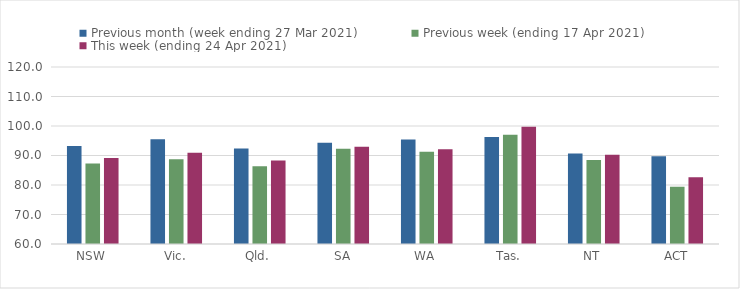
| Category | Previous month (week ending 27 Mar 2021) | Previous week (ending 17 Apr 2021) | This week (ending 24 Apr 2021) |
|---|---|---|---|
| NSW | 93.25 | 87.33 | 89.12 |
| Vic. | 95.47 | 88.77 | 90.9 |
| Qld. | 92.34 | 86.32 | 88.33 |
| SA | 94.34 | 92.26 | 92.96 |
| WA | 95.44 | 91.27 | 92.15 |
| Tas. | 96.24 | 97.04 | 99.76 |
| NT | 90.7 | 88.5 | 90.27 |
| ACT | 89.71 | 79.41 | 82.66 |